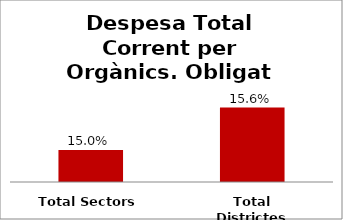
| Category | Series 0 |
|---|---|
| Total Sectors | 0.15 |
| Total Districtes | 0.156 |